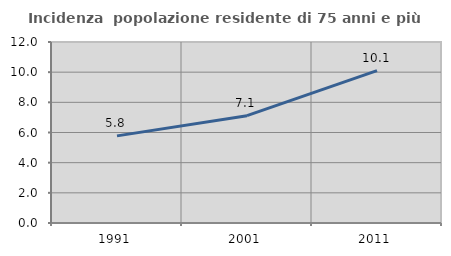
| Category | Incidenza  popolazione residente di 75 anni e più |
|---|---|
| 1991.0 | 5.777 |
| 2001.0 | 7.115 |
| 2011.0 | 10.1 |